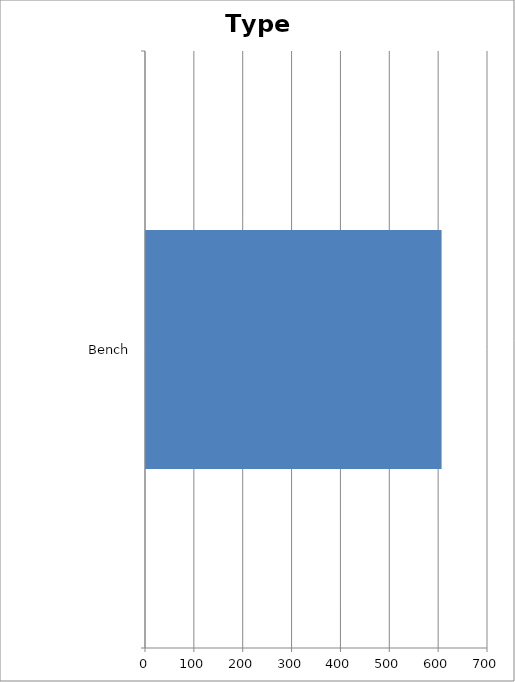
| Category | Type |
|---|---|
| Bench | 605 |